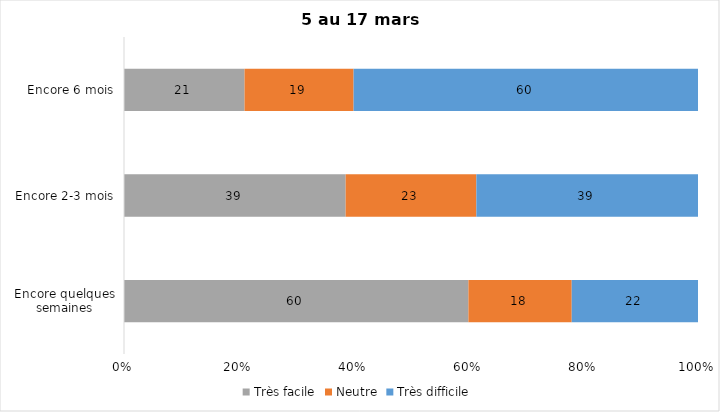
| Category | Très facile | Neutre | Très difficile |
|---|---|---|---|
| Encore quelques semaines | 60 | 18 | 22 |
| Encore 2-3 mois | 39 | 23 | 39 |
| Encore 6 mois | 21 | 19 | 60 |